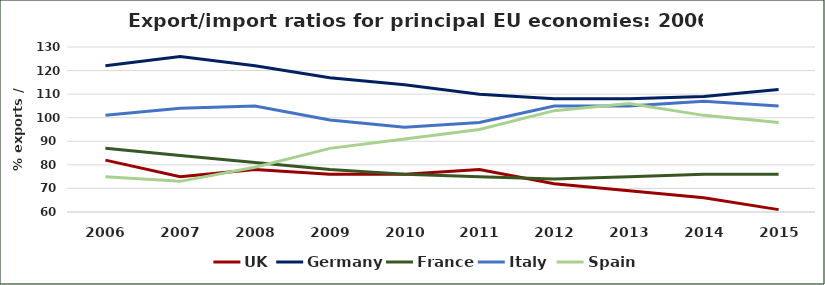
| Category | UK | Germany | France | Italy  | Spain |
|---|---|---|---|---|---|
| 2006.0 | 82 | 122 | 87 | 101 | 75 |
| 2007.0 | 75 | 126 | 84 | 104 | 73 |
| 2008.0 | 78 | 122 | 81 | 105 | 79 |
| 2009.0 | 76 | 117 | 78 | 99 | 87 |
| 2010.0 | 76 | 114 | 76 | 96 | 91 |
| 2011.0 | 78 | 110 | 75 | 98 | 95 |
| 2012.0 | 72 | 108 | 74 | 105 | 103 |
| 2013.0 | 69 | 108 | 75 | 105 | 106 |
| 2014.0 | 66 | 109 | 76 | 107 | 101 |
| 2015.0 | 61 | 112 | 76 | 105 | 98 |